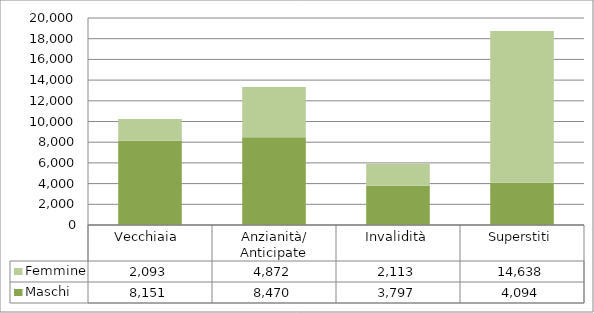
| Category | Maschi | Femmine |
|---|---|---|
| Vecchiaia  | 8151 | 2093 |
| Anzianità/ Anticipate | 8470 | 4872 |
| Invalidità | 3797 | 2113 |
| Superstiti | 4094 | 14638 |